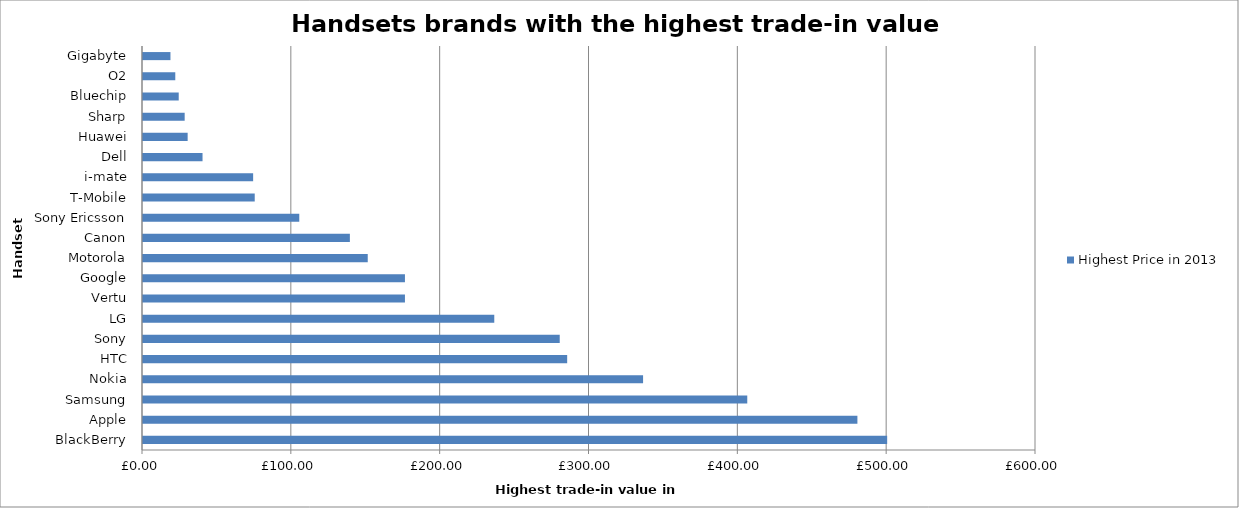
| Category | Highest Price in 2013 |
|---|---|
| BlackBerry | 500 |
| Apple | 480 |
| Samsung | 406 |
| Nokia | 336 |
| HTC | 285 |
| Sony | 280 |
| LG | 236.02 |
| Vertu | 176 |
| Google | 176 |
| Motorola | 151 |
| Canon | 139 |
| Sony Ericsson | 105 |
| T-Mobile | 75.07 |
| i-mate | 74 |
| Dell | 40 |
| Huawei | 30 |
| Sharp | 28 |
| Bluechip | 24 |
| O2 | 21.69 |
| Gigabyte | 18.45 |